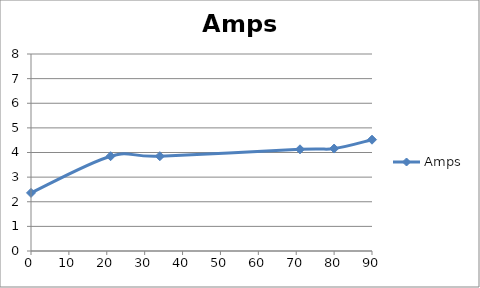
| Category | Amps |
|---|---|
| 0.0 | 2.36 |
| 21.0 | 3.85 |
| 34.0 | 3.85 |
| 71.0 | 4.13 |
| 80.0 | 4.16 |
| 90.0 | 4.52 |